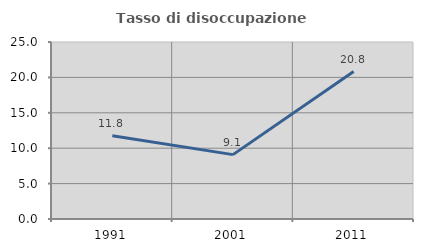
| Category | Tasso di disoccupazione giovanile  |
|---|---|
| 1991.0 | 11.754 |
| 2001.0 | 9.091 |
| 2011.0 | 20.833 |